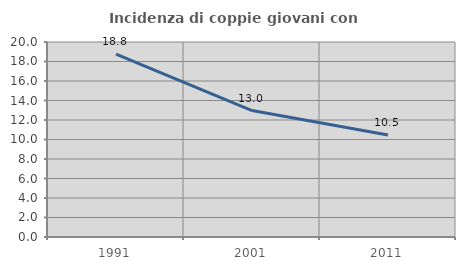
| Category | Incidenza di coppie giovani con figli |
|---|---|
| 1991.0 | 18.761 |
| 2001.0 | 12.968 |
| 2011.0 | 10.452 |